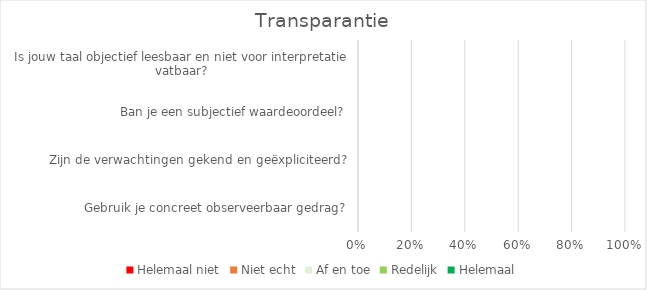
| Category | Helemaal niet | Niet echt | Af en toe | Redelijk | Helemaal |
|---|---|---|---|---|---|
| Gebruik je concreet observeerbaar gedrag? | 0 | 0 | 0 | 0 | 0 |
| Zijn de verwachtingen gekend en geëxpliciteerd? | 0 | 0 | 0 | 0 | 0 |
| Ban je een subjectief waardeoordeel? | 0 | 0 | 0 | 0 | 0 |
| Is jouw taal objectief leesbaar en niet voor interpretatie vatbaar? | 0 | 0 | 0 | 0 | 0 |